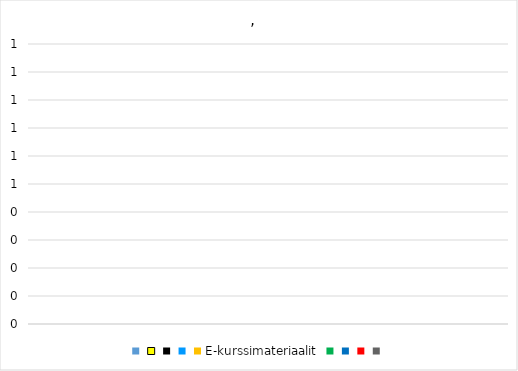
| Category | Series 0 | Series 1 | Series 2 | Series 3 | E-kurssimateriaalit | Series 5 | Series 6 | Series 7 | Series 8 |
|---|---|---|---|---|---|---|---|---|---|
| 0 | 0 | 0 | 0 | 0 | 0 | 0 | 0 | 0 | 0 |
| 1 | 0 | 0 | 0 | 0 | 0 | 0 | 0 | 0 | 0 |